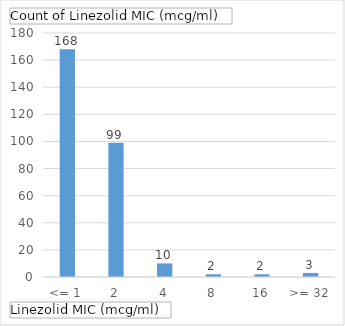
| Category | Total |
|---|---|
| <= 1 | 168 |
| 2 | 99 |
| 4 | 10 |
| 8 | 2 |
| 16 | 2 |
| >= 32 | 3 |